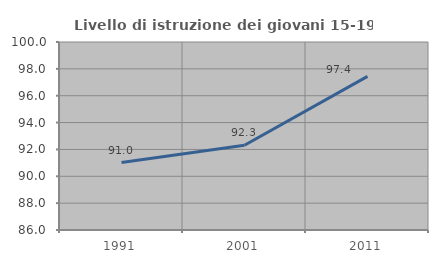
| Category | Livello di istruzione dei giovani 15-19 anni |
|---|---|
| 1991.0 | 91.026 |
| 2001.0 | 92.308 |
| 2011.0 | 97.436 |